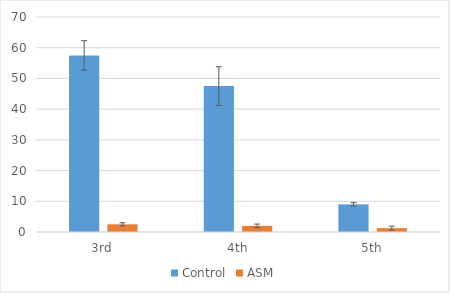
| Category | Control | ASM |
|---|---|---|
| 3rd | 57.5 | 2.5 |
| 4th | 47.5 | 2 |
| 5th | 9 | 1.25 |